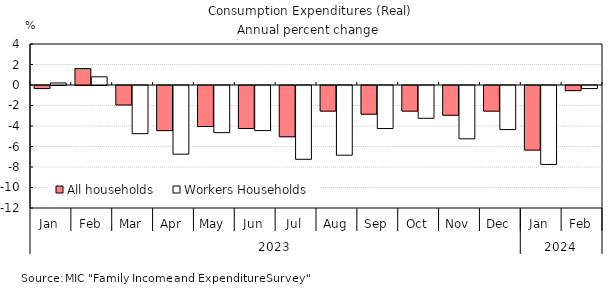
| Category | All households | Workers Households |
|---|---|---|
| 0 | -0.3 | 0.2 |
| 1 | 1.6 | 0.8 |
| 2 | -1.9 | -4.7 |
| 3 | -4.4 | -6.7 |
| 4 | -4 | -4.6 |
| 5 | -4.2 | -4.4 |
| 6 | -5 | -7.2 |
| 7 | -2.5 | -6.8 |
| 8 | -2.8 | -4.2 |
| 9 | -2.5 | -3.2 |
| 10 | -2.9 | -5.2 |
| 11 | -2.5 | -4.3 |
| 12 | -6.3 | -7.7 |
| 13 | -0.5 | -0.3 |